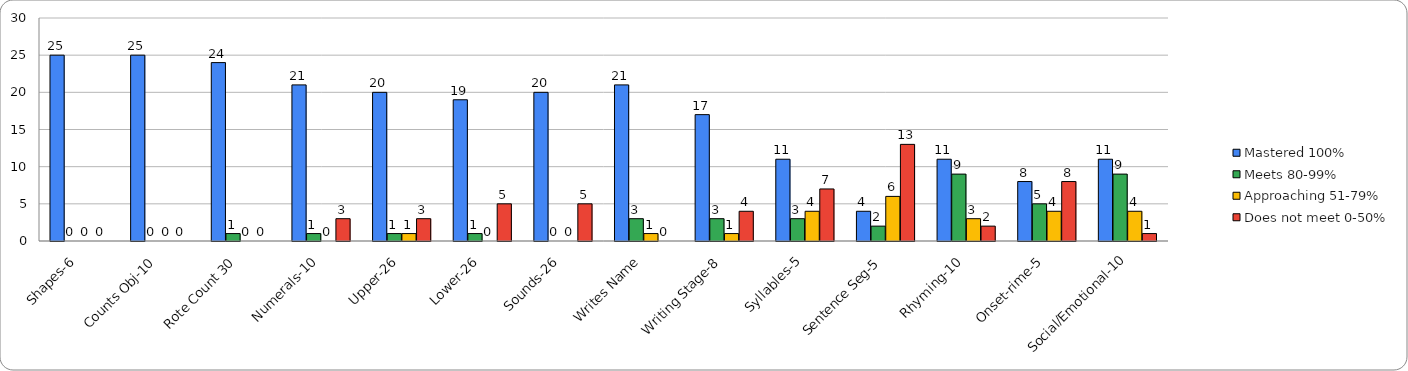
| Category | Mastered 100% | Meets 80-99% | Approaching 51-79% | Does not meet 0-50% |
|---|---|---|---|---|
| Shapes-6 | 25 | 0 | 0 | 0 |
| Counts Obj-10 | 25 | 0 | 0 | 0 |
| Rote Count 30 | 24 | 1 | 0 | 0 |
| Numerals-10 | 21 | 1 | 0 | 3 |
| Upper-26 | 20 | 1 | 1 | 3 |
| Lower-26 | 19 | 1 | 0 | 5 |
| Sounds-26 | 20 | 0 | 0 | 5 |
| Writes Name | 21 | 3 | 1 | 0 |
| Writing Stage-8 | 17 | 3 | 1 | 4 |
| Syllables-5 | 11 | 3 | 4 | 7 |
| Sentence Seg-5 | 4 | 2 | 6 | 13 |
| Rhyming-10 | 11 | 9 | 3 | 2 |
| Onset-rime-5 | 8 | 5 | 4 | 8 |
| Social/Emotional-10 | 11 | 9 | 4 | 1 |